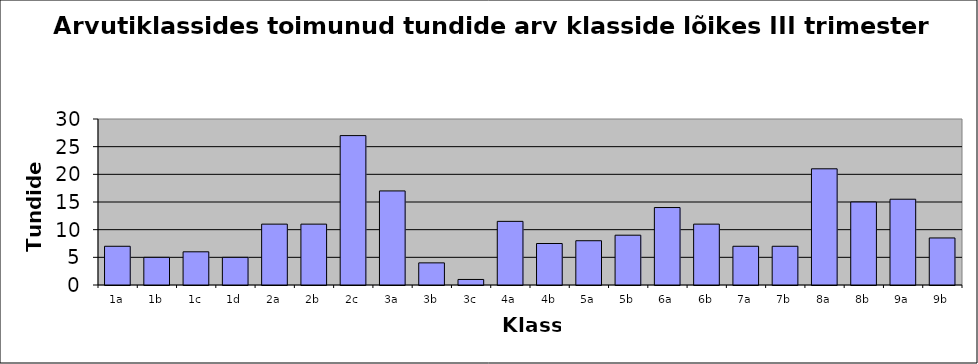
| Category | Series 0 |
|---|---|
| 1a | 7 |
| 1b | 5 |
| 1c | 6 |
| 1d | 5 |
| 2a | 11 |
| 2b | 11 |
| 2c | 27 |
| 3a | 17 |
| 3b | 4 |
| 3c | 1 |
| 4a | 11.5 |
| 4b | 7.5 |
| 5a | 8 |
| 5b | 9 |
| 6a | 14 |
| 6b | 11 |
| 7a | 7 |
| 7b | 7 |
| 8a | 21 |
| 8b | 15 |
| 9a | 15.5 |
| 9b | 8.5 |